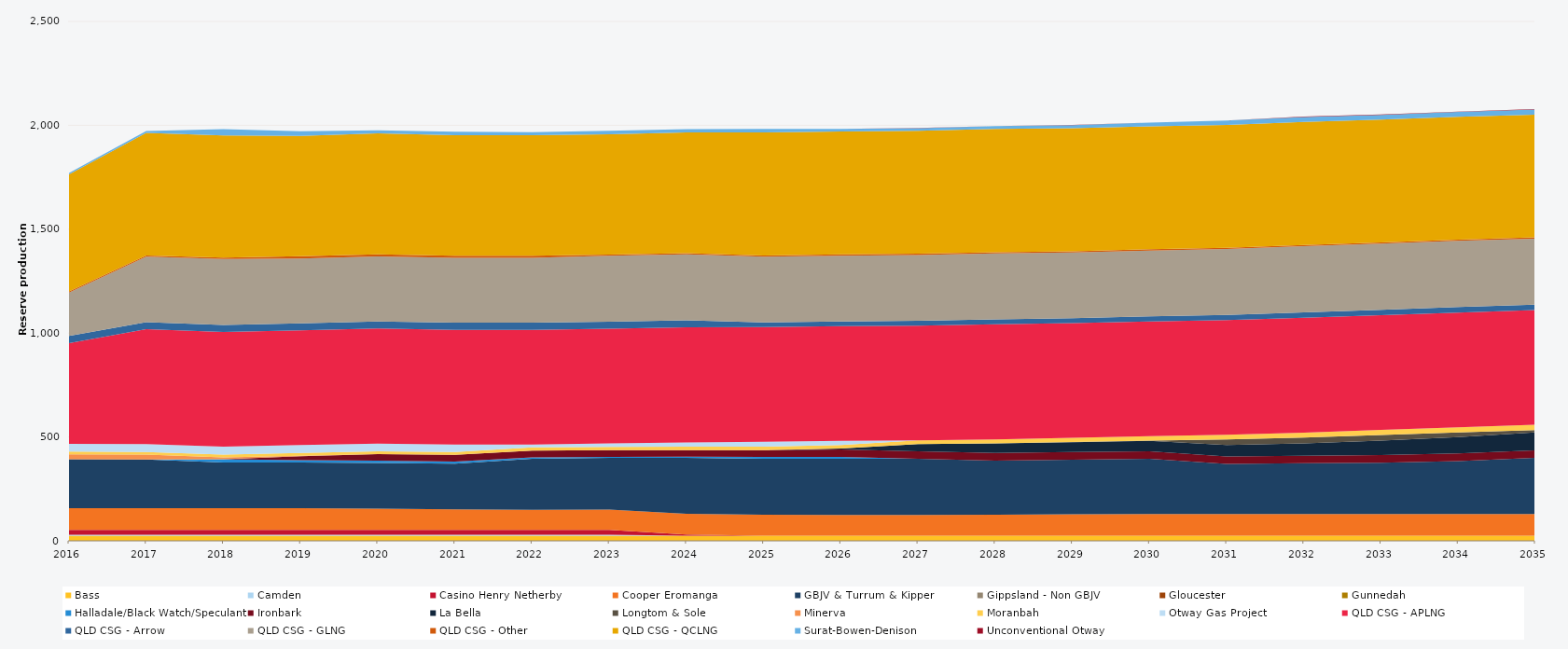
| Category | Bass | Camden | Casino Henry Netherby | Cooper Eromanga | GBJV & Turrum & Kipper | Gippsland - Non GBJV | Gloucester | Gunnedah | Halladale/Black Watch/Speculant | Ironbark | La Bella | Longtom & Sole | Minerva | Moranbah | Otway Gas Project | QLD CSG - APLNG | QLD CSG - Arrow | QLD CSG - GLNG | QLD CSG - Other | QLD CSG - QCLNG | Surat-Bowen-Denison | Unconventional Otway |
|---|---|---|---|---|---|---|---|---|---|---|---|---|---|---|---|---|---|---|---|---|---|---|
| 2016 | 24.522 | 5 | 23.12 | 105 | 235.041 | 0 | 0 | 0 | 0 | 0 | 0 | 0 | 23.79 | 12.859 | 38 | 484.594 | 34.038 | 209.001 | 5.856 | 563.547 | 5.945 | 0 |
| 2017 | 24.455 | 5 | 23.12 | 105 | 233.892 | 0 | 0 | 0 | 0 | 0 | 0 | 0 | 23.725 | 12.863 | 38 | 552.245 | 33.945 | 315.709 | 5.84 | 589.493 | 9.086 | 0 |
| 2018 | 24.455 | 5 | 23.12 | 105 | 220 | 0 | 0 | 0 | 14.901 | 0 | 0 | 0 | 9.422 | 13.029 | 38 | 552.245 | 33.945 | 317.904 | 5.84 | 588.867 | 30 | 0 |
| 2019 | 24.455 | 5 | 23.12 | 105 | 220 | 0 | 0 | 0 | 10.95 | 18.25 | 0 | 0 | 3.339 | 12.796 | 38 | 552.245 | 33.945 | 312.037 | 10.403 | 579.711 | 22.137 | 0 |
| 2020 | 24.522 | 5 | 23.12 | 101.977 | 220 | 0 | 0 | 0 | 10.95 | 31.587 | 0 | 0 | 0.475 | 12.768 | 38 | 553.758 | 34.038 | 312.824 | 10.419 | 581.442 | 15.26 | 0 |
| 2021 | 24.455 | 5 | 23.12 | 98.518 | 220 | 0 | 0 | 0 | 10.95 | 31.51 | 0 | 0 | 0 | 13.526 | 36.482 | 552.245 | 33.945 | 311.967 | 10.403 | 580.143 | 16.54 | 0 |
| 2022 | 24.455 | 5 | 23.12 | 96.855 | 245.927 | 0 | 0 | 0 | 6.747 | 32.125 | 0 | 0 | 0 | 15.305 | 14.195 | 552.245 | 33.945 | 311.905 | 10.403 | 579.646 | 15.538 | 0 |
| 2023 | 24.455 | 5 | 23.12 | 97.871 | 249.552 | 0 | 0 | 0 | 4.165 | 32.08 | 0 | 0 | 0 | 16.282 | 16.401 | 552.245 | 33.945 | 316.633 | 5.84 | 579.627 | 16.084 | 0 |
| 2024 | 24.522 | 0 | 5.3 | 99.942 | 270 | 0 | 0 | 0 | 5.319 | 31.818 | 0 | 0 | 0 | 16.806 | 20.006 | 553.758 | 34.038 | 317.367 | 5.856 | 580.633 | 16.459 | 0 |
| 2025 | 24.455 | 0 | 0 | 100.749 | 270 | 0 | 0 | 0 | 8.848 | 32.252 | 0 | 0 | 0 | 17.285 | 23.306 | 552.245 | 22.077 | 316.806 | 5.84 | 591.794 | 17.198 | 0 |
| 2026 | 24.455 | 0 | 0 | 100.482 | 270 | 0 | 0 | 0 | 9.169 | 35.334 | 4.714 | 0 | 0 | 17.534 | 19.216 | 552.245 | 22.876 | 316.704 | 5.84 | 591.753 | 11.928 | 0 |
| 2027 | 24.455 | 0 | 0 | 100.567 | 270 | 0 | 0 | 0 | 0 | 35.715 | 35.007 | 0 | 0 | 18.159 | 0 | 552.245 | 23.167 | 316.867 | 5.84 | 591.694 | 12.145 | 0.82 |
| 2028 | 24.522 | 0 | 0 | 100.767 | 261.09 | 0 | 0 | 0 | 0 | 36.6 | 46.441 | 0 | 0 | 19.008 | 0 | 553.758 | 23.513 | 317.838 | 5.856 | 593.235 | 13.041 | 0.951 |
| 2029 | 24.455 | 0 | 0 | 103.126 | 263.426 | 0 | 0 | 0 | 0 | 36.5 | 47.125 | 0.639 | 0 | 20.36 | 0 | 552.245 | 23.397 | 316.91 | 5.84 | 591.622 | 15.563 | 0.972 |
| 2030 | 24.455 | 0 | 0 | 105 | 265.134 | 0 | 0 | 0 | 0 | 36.5 | 50.708 | 0.73 | 0 | 21.622 | 0 | 552.245 | 23.644 | 317.293 | 5.84 | 591.579 | 17.913 | 0.775 |
| 2031 | 24.455 | 0 | 0 | 105 | 240.515 | 0 | 0 | 0 | 0 | 36.5 | 54.185 | 27.375 | 0 | 22.567 | 0 | 552.245 | 24.211 | 317.568 | 5.84 | 591.53 | 20.661 | 0.816 |
| 2032 | 24.522 | 0 | 0 | 105 | 243.786 | 0 | 0 | 0 | 0 | 36.6 | 59.276 | 27.45 | 0 | 23.484 | 0 | 553.758 | 25.31 | 318.7 | 5.856 | 593.07 | 23.685 | 1.633 |
| 2033 | 24.455 | 0 | 0 | 105 | 246.486 | 0 | 0 | 0 | 0 | 36.5 | 70.136 | 27.375 | 0 | 23.992 | 0 | 552.245 | 26.325 | 318.169 | 5.84 | 591.435 | 22.62 | 1.347 |
| 2034 | 24.455 | 0 | 0 | 105 | 254.774 | 0 | 0 | 0 | 0 | 36.5 | 78.516 | 22.914 | 0 | 24.563 | 0 | 552.245 | 26.511 | 318.356 | 5.84 | 591.394 | 23.718 | 1.435 |
| 2035 | 24.455 | 0 | 0 | 105 | 270 | 0 | 0 | 0 | 0 | 36.5 | 86.369 | 11.249 | 0 | 24.813 | 0 | 552.245 | 26.426 | 317.84 | 5.84 | 591.053 | 23.995 | 2.251 |